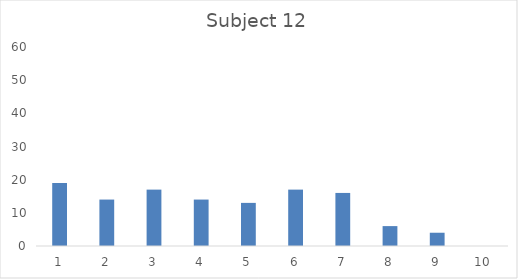
| Category | Frequency |
|---|---|
| 0 | 19 |
| 1 | 14 |
| 2 | 17 |
| 3 | 14 |
| 4 | 13 |
| 5 | 17 |
| 6 | 16 |
| 7 | 6 |
| 8 | 4 |
| 9 | 0 |